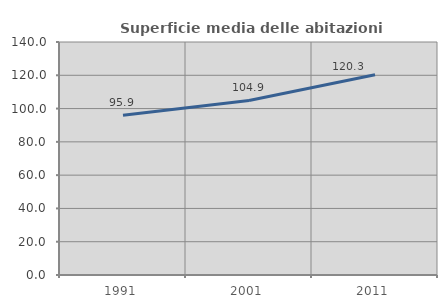
| Category | Superficie media delle abitazioni occupate |
|---|---|
| 1991.0 | 95.931 |
| 2001.0 | 104.904 |
| 2011.0 | 120.318 |